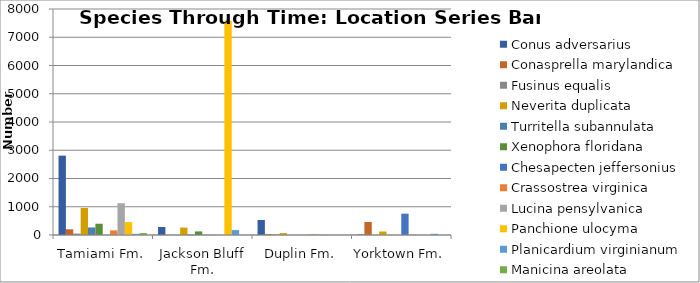
| Category | Conus adversarius | Conasprella marylandica | Fusinus equalis | Neverita duplicata | Turritella subannulata | Xenophora floridana | Chesapecten jeffersonius | Crassostrea virginica | Lucina pensylvanica | Panchione ulocyma | Planicardium virginianum | Manicina areolata |
|---|---|---|---|---|---|---|---|---|---|---|---|---|
| Tamiami Fm. | 2810 | 202 | 50 | 958 | 267 | 399 | 2 | 164 | 1124 | 457 | 41 | 68 |
| Jackson Bluff Fm. | 284 | 6 | 4 | 264 | 13 | 127 | 6 | 2 | 0 | 7580 | 175 | 0 |
| Duplin Fm. | 531 | 31 | 20 | 68 | 1 | 0 | 0 | 16 | 9 | 0 | 0 | 0 |
| Yorktown Fm. | 17 | 460 | 0 | 124 | 0 | 0 | 755 | 13 | 0 | 0 | 42 | 0 |